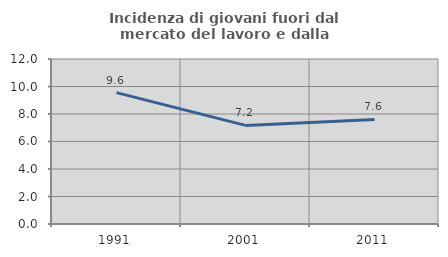
| Category | Incidenza di giovani fuori dal mercato del lavoro e dalla formazione  |
|---|---|
| 1991.0 | 9.558 |
| 2001.0 | 7.171 |
| 2011.0 | 7.606 |